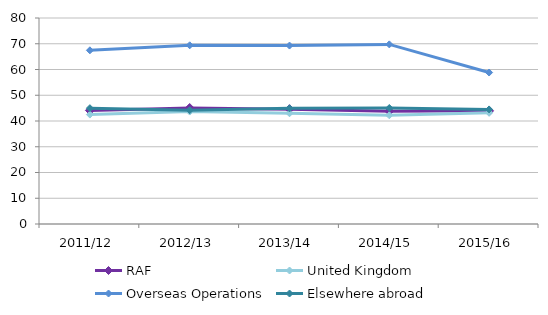
| Category | RAF | United Kingdom | Overseas Operations | Elsewhere abroad |
|---|---|---|---|---|
| 2011/12 | 44.114 | 42.499 | 67.449 | 44.986 |
| 2012/13 | 45.039 | 43.665 | 69.395 | 44.173 |
| 2013/14 | 44.609 | 43.005 | 69.297 | 44.922 |
| 2014/15 | 43.826 | 42.219 | 69.756 | 45.051 |
| 2015/16 | 43.935 | 43.167 | 58.827 | 44.495 |